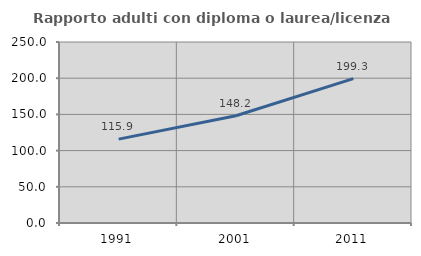
| Category | Rapporto adulti con diploma o laurea/licenza media  |
|---|---|
| 1991.0 | 115.874 |
| 2001.0 | 148.197 |
| 2011.0 | 199.346 |